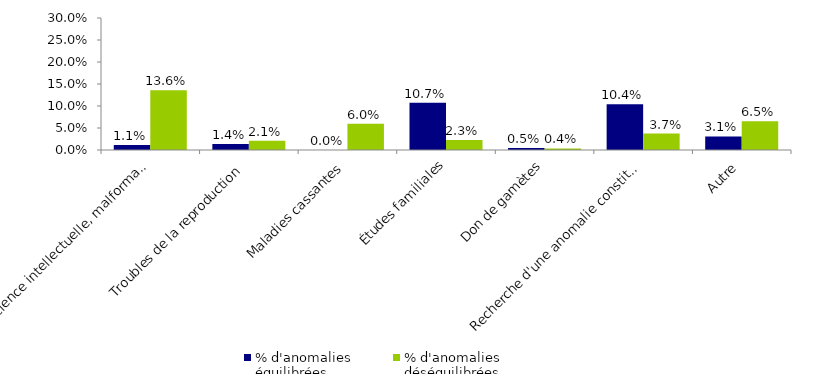
| Category | % d'anomalies 
équilibrées | % d'anomalies 
déséquilibrées |
|---|---|---|
| Déficience intellectuelle, malformation, anomalies du développement | 0.011 | 0.136 |
| Troubles de la reproduction | 0.014 | 0.021 |
| Maladies cassantes | 0 | 0.06 |
| Études familiales | 0.107 | 0.023 |
| Don de gamètes | 0.005 | 0.004 |
| Recherche d'une anomalie constitutionnelle suite à la réalisation d'un examen somatique | 0.104 | 0.037 |
| Autre | 0.031 | 0.065 |